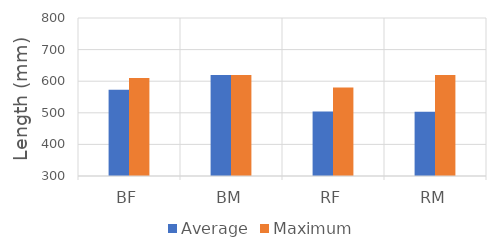
| Category | Average | Maximum |
|---|---|---|
| BF | 573 | 610 |
| BM | 620 | 620 |
| RF | 504 | 580 |
| RM | 503 | 620 |